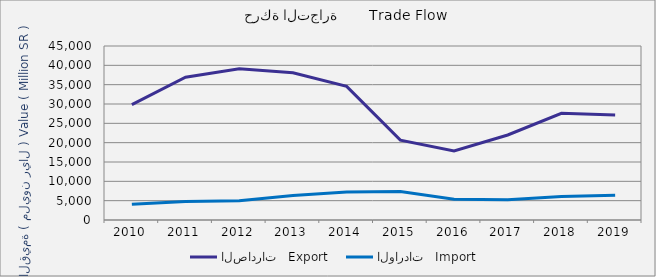
| Category | الصادرات   Export | الواردات   Import |
|---|---|---|
| 2010.0 | 29849416932 | 4044019041 |
| 2011.0 | 36934933635 | 4779764239 |
| 2012.0 | 39121340141 | 4996460700 |
| 2013.0 | 38080594574 | 6359872934 |
| 2014.0 | 34558930393 | 7265595645 |
| 2015.0 | 20652294631 | 7359149425 |
| 2016.0 | 17884385105 | 5352565947 |
| 2017.0 | 21993066267 | 5229445824 |
| 2018.0 | 27594919442 | 6098682511 |
| 2019.0 | 27177212924 | 6426293129 |